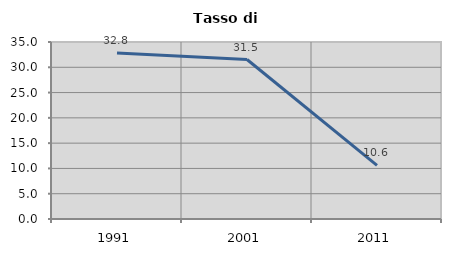
| Category | Tasso di disoccupazione   |
|---|---|
| 1991.0 | 32.808 |
| 2001.0 | 31.538 |
| 2011.0 | 10.618 |